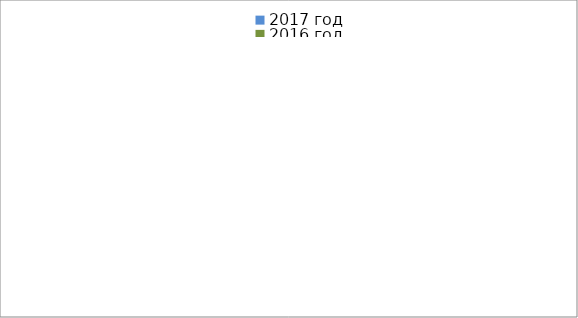
| Category | 2017 год | 2016 год |
|---|---|---|
|  - поджог | 3 | 24 |
|  - неосторожное обращение с огнём | 2 | 17 |
|  - НПТЭ электрооборудования | 8 | 4 |
|  - НПУ и Э печей | 23 | 21 |
|  - НПУ и Э транспортных средств | 33 | 10 |
|   -Шалость с огнем детей | 4 | 4 |
|  -НППБ при эксплуатации эл.приборов | 18 | 4 |
|  - курение | 19 | 7 |
| - прочие | 35 | 44 |
| - не установленные причины | 0 | 11 |